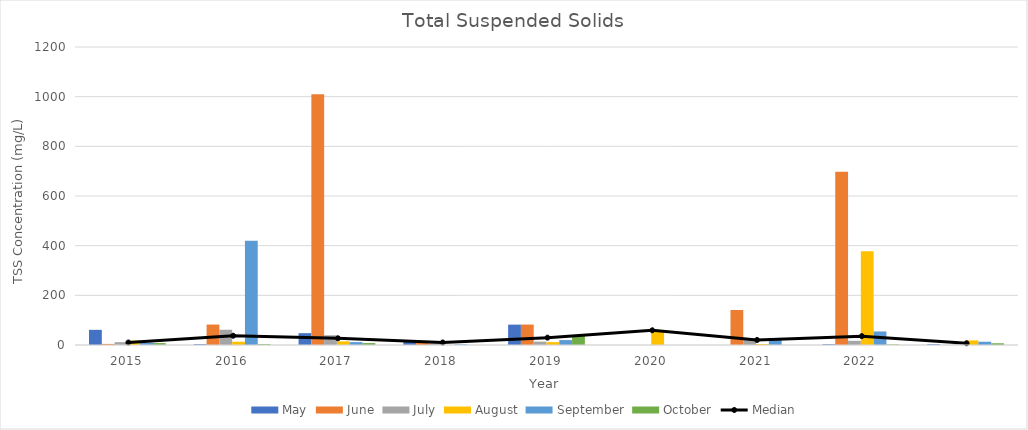
| Category | May | June | July | August | September | October |
|---|---|---|---|---|---|---|
| 2015.0 | 61 | 4.4 | 11.4 | 17.4 | 8.75 | 7.8 |
| 2016.0 | 3.2 | 82.3 | 61.4 | 13.2 | 420 | 3.2 |
| 2017.0 | 47.7 | 1010 | 39.3 | 14.7 | 11.6 | 7.8 |
| 2018.0 | 15 | 13.3 | 7 | 0 | 2.6 | 0 |
| 2019.0 | 82 | 82.3 | 13.6 | 11.5 | 19.8 | 39.5 |
| 2020.0 | 0 | 0 | 0 | 59.2 | 0 | 0 |
| 2021.0 | 0 | 141 | 20.6 | 4 | 19.8 | 0 |
| 2022.0 | 3 | 698 | 16.9 | 378 | 54.5 | 2.2 |